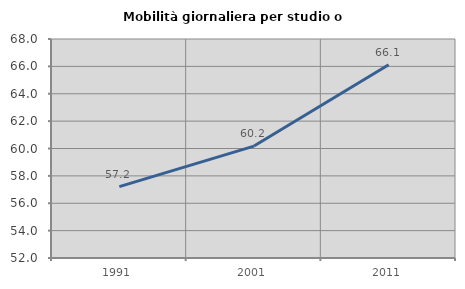
| Category | Mobilità giornaliera per studio o lavoro |
|---|---|
| 1991.0 | 57.219 |
| 2001.0 | 60.177 |
| 2011.0 | 66.115 |